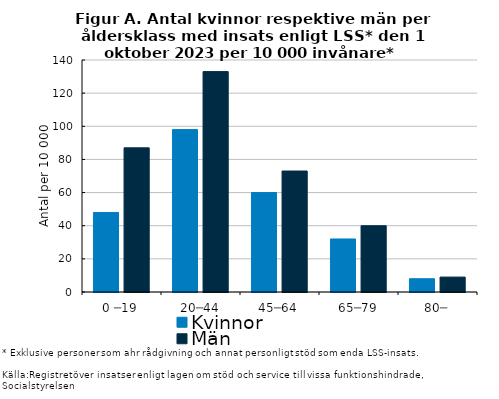
| Category | Kvinnor | Män |
|---|---|---|
| 0 ─19 | 48 | 87 |
| 20─44 | 98 | 133 |
| 45─64 | 60 | 73 |
| 65─79 | 32 | 40 |
| 80─ | 8 | 9 |